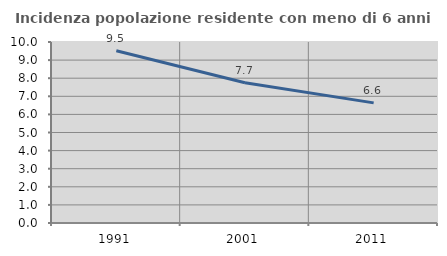
| Category | Incidenza popolazione residente con meno di 6 anni |
|---|---|
| 1991.0 | 9.519 |
| 2001.0 | 7.747 |
| 2011.0 | 6.637 |